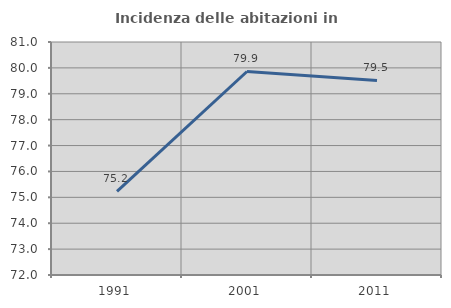
| Category | Incidenza delle abitazioni in proprietà  |
|---|---|
| 1991.0 | 75.229 |
| 2001.0 | 79.861 |
| 2011.0 | 79.514 |